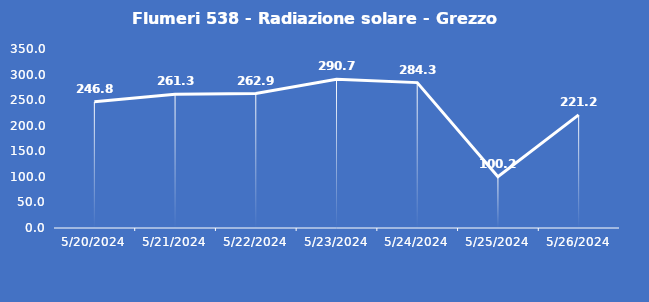
| Category | Flumeri 538 - Radiazione solare - Grezzo (W/m2) |
|---|---|
| 5/20/24 | 246.8 |
| 5/21/24 | 261.3 |
| 5/22/24 | 262.9 |
| 5/23/24 | 290.7 |
| 5/24/24 | 284.3 |
| 5/25/24 | 100.2 |
| 5/26/24 | 221.2 |